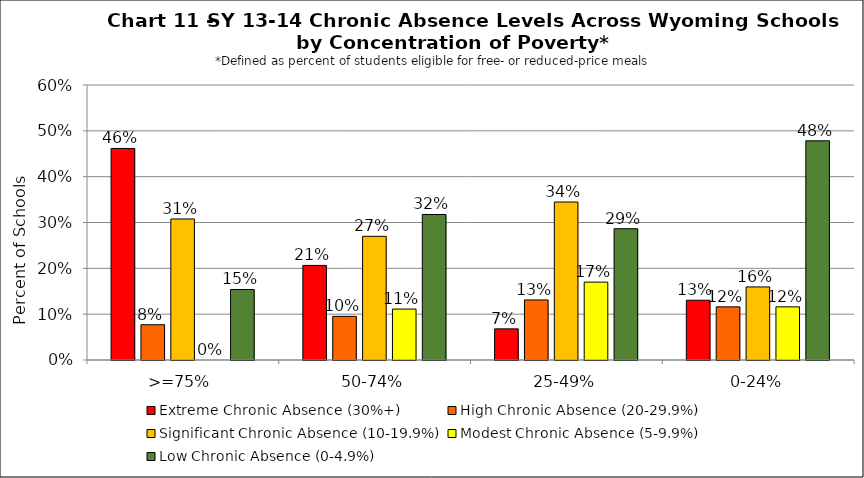
| Category | Extreme Chronic Absence (30%+) | High Chronic Absence (20-29.9%) | Significant Chronic Absence (10-19.9%) | Modest Chronic Absence (5-9.9%) | Low Chronic Absence (0-4.9%) |
|---|---|---|---|---|---|
| 0 | 0.462 | 0.077 | 0.308 | 0 | 0.154 |
| 1 | 0.206 | 0.095 | 0.27 | 0.111 | 0.317 |
| 2 | 0.068 | 0.131 | 0.345 | 0.17 | 0.286 |
| 3 | 0.13 | 0.116 | 0.159 | 0.116 | 0.478 |